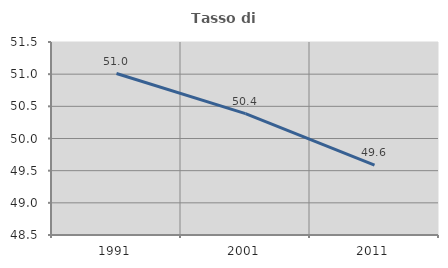
| Category | Tasso di occupazione   |
|---|---|
| 1991.0 | 51.01 |
| 2001.0 | 50.388 |
| 2011.0 | 49.586 |